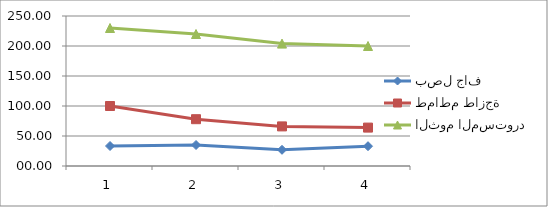
| Category | بصل جاف | طماطم طازجة | الثوم المستورد |
|---|---|---|---|
| 0 | 33.33 | 100 | 230 |
| 1 | 35 | 78 | 220 |
| 2 | 27 | 66 | 204 |
| 3 | 33 | 64 | 200 |